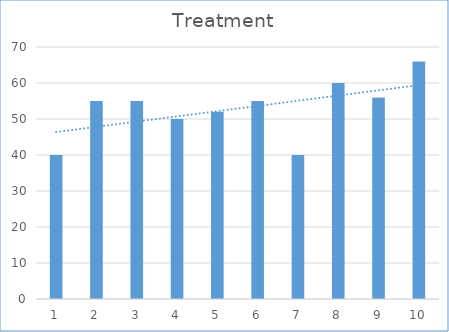
| Category | Series 0 |
|---|---|
| 0 | 40 |
| 1 | 55 |
| 2 | 55 |
| 3 | 50 |
| 4 | 52 |
| 5 | 55 |
| 6 | 40 |
| 7 | 60 |
| 8 | 56 |
| 9 | 66 |